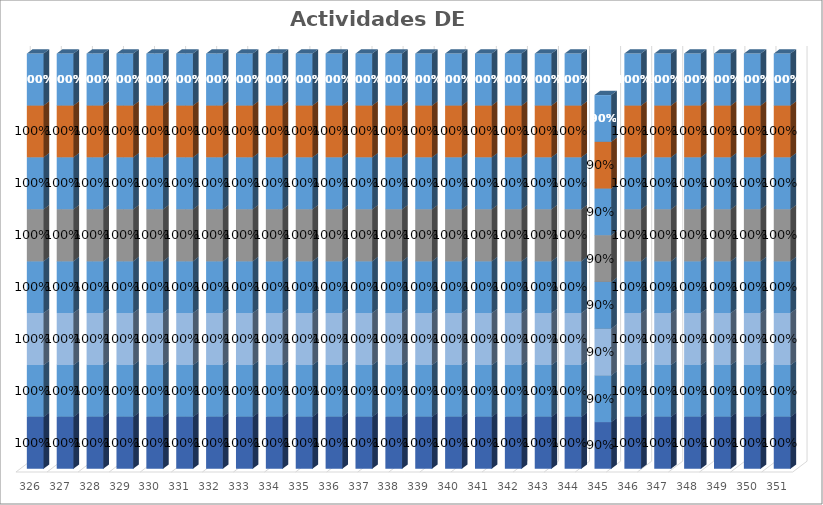
| Category | % Avance |
|---|---|
| 326.0 | 1 |
| 327.0 | 1 |
| 328.0 | 1 |
| 329.0 | 1 |
| 330.0 | 1 |
| 331.0 | 1 |
| 332.0 | 1 |
| 333.0 | 1 |
| 334.0 | 1 |
| 335.0 | 1 |
| 336.0 | 1 |
| 337.0 | 1 |
| 338.0 | 1 |
| 339.0 | 1 |
| 340.0 | 1 |
| 341.0 | 1 |
| 342.0 | 1 |
| 343.0 | 1 |
| 344.0 | 1 |
| 345.0 | 0.9 |
| 346.0 | 1 |
| 347.0 | 1 |
| 348.0 | 1 |
| 349.0 | 1 |
| 350.0 | 1 |
| 351.0 | 1 |